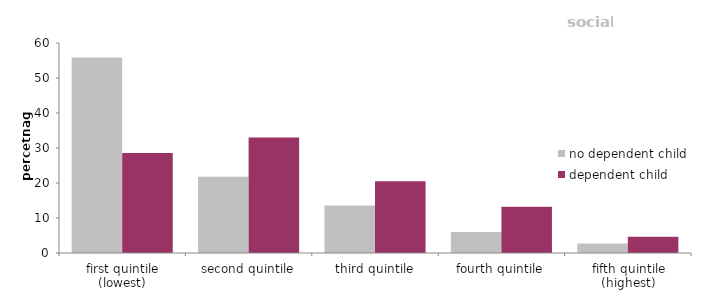
| Category | no dependent child | dependent child |
|---|---|---|
| first quintile (lowest) | 55.83 | 28.554 |
| second quintile | 21.79 | 33.017 |
| third quintile | 13.607 | 20.533 |
| fourth quintile | 6.033 | 13.241 |
| fifth quintile (highest) | 2.741 | 4.655 |